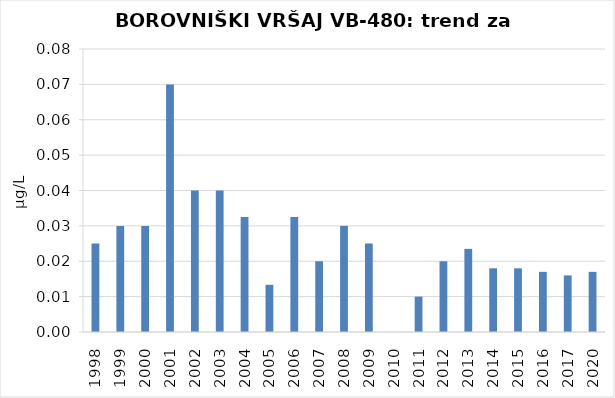
| Category | Vsota |
|---|---|
| 1998 | 0.025 |
| 1999 | 0.03 |
| 2000 | 0.03 |
| 2001 | 0.07 |
| 2002 | 0.04 |
| 2003 | 0.04 |
| 2004 | 0.032 |
| 2005 | 0.013 |
| 2006 | 0.032 |
| 2007 | 0.02 |
| 2008 | 0.03 |
| 2009 | 0.025 |
| 2010 | 0 |
| 2011 | 0.01 |
| 2012 | 0.02 |
| 2013 | 0.024 |
| 2014 | 0.018 |
| 2015 | 0.018 |
| 2016 | 0.017 |
| 2017 | 0.016 |
| 2020 | 0.017 |